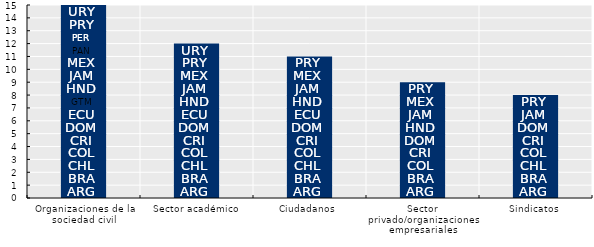
| Category | ARG | BRA | CHL | COL | CRI | DOM | ECU | GTM | HND | JAM | MEX | PAN | PER | PRY | URY |
|---|---|---|---|---|---|---|---|---|---|---|---|---|---|---|---|
| Organizaciones de la sociedad civil | 1 | 1 | 1 | 1 | 1 | 1 | 1 | 1 | 1 | 1 | 1 | 1 | 1 | 1 | 1 |
| Sector académico | 1 | 1 | 1 | 1 | 1 | 1 | 1 | 0 | 1 | 1 | 1 | 0 | 0 | 1 | 1 |
| Ciudadanos  | 1 | 1 | 1 | 1 | 1 | 1 | 1 | 0 | 1 | 1 | 1 | 0 | 0 | 1 | 0 |
| Sector privado/organizaciones empresariales | 1 | 1 | 0 | 1 | 1 | 1 | 0 | 0 | 1 | 1 | 1 | 0 | 0 | 1 | 0 |
| Sindicatos | 1 | 1 | 1 | 1 | 1 | 1 | 0 | 0 | 0 | 1 | 0 | 0 | 0 | 1 | 0 |